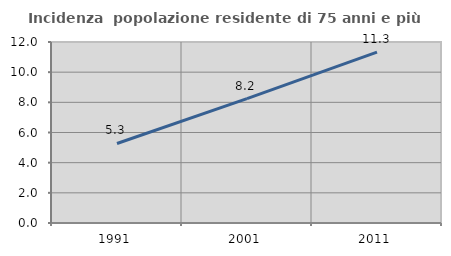
| Category | Incidenza  popolazione residente di 75 anni e più |
|---|---|
| 1991.0 | 5.273 |
| 2001.0 | 8.242 |
| 2011.0 | 11.327 |